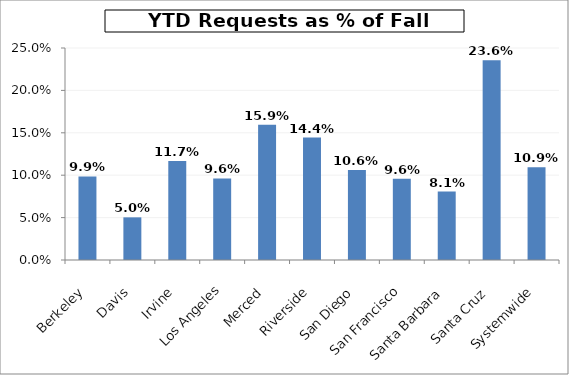
| Category | Series 0 |
|---|---|
| Berkeley | 0.099 |
| Davis | 0.05 |
| Irvine | 0.117 |
| Los Angeles | 0.096 |
| Merced | 0.159 |
| Riverside | 0.144 |
| San Diego | 0.106 |
| San Francisco | 0.096 |
| Santa Barbara | 0.081 |
| Santa Cruz | 0.236 |
| Systemwide | 0.109 |